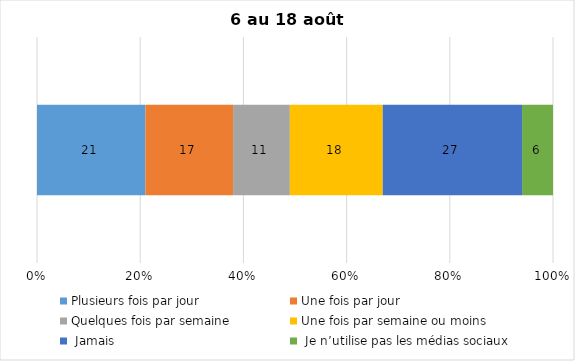
| Category | Plusieurs fois par jour | Une fois par jour | Quelques fois par semaine   | Une fois par semaine ou moins   |  Jamais   |  Je n’utilise pas les médias sociaux |
|---|---|---|---|---|---|---|
| 0 | 21 | 17 | 11 | 18 | 27 | 6 |